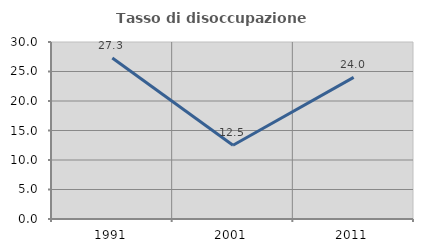
| Category | Tasso di disoccupazione giovanile  |
|---|---|
| 1991.0 | 27.273 |
| 2001.0 | 12.5 |
| 2011.0 | 24 |